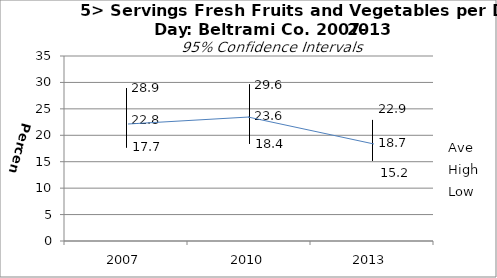
| Category | Ave | High | Low |
|---|---|---|---|
| 2007.0 | 22.8 | 28.9 | 17.7 |
| 2010.0 | 23.6 | 29.6 | 18.4 |
| 2013.0 | 18.7 | 22.9 | 15.2 |